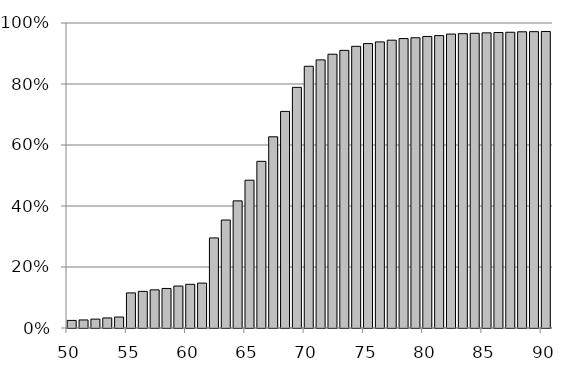
| Category | 100% Adequate |
|---|---|
| 50.0 | 0.025 |
| 51.0 | 0.026 |
| 52.0 | 0.029 |
| 53.0 | 0.033 |
| 54.0 | 0.036 |
| 55.0 | 0.115 |
| 56.0 | 0.12 |
| 57.0 | 0.125 |
| 58.0 | 0.13 |
| 59.0 | 0.138 |
| 60.0 | 0.143 |
| 61.0 | 0.147 |
| 62.0 | 0.295 |
| 63.0 | 0.354 |
| 64.0 | 0.417 |
| 65.0 | 0.485 |
| 66.0 | 0.546 |
| 67.0 | 0.627 |
| 68.0 | 0.71 |
| 69.0 | 0.789 |
| 70.0 | 0.858 |
| 71.0 | 0.879 |
| 72.0 | 0.898 |
| 73.0 | 0.91 |
| 74.0 | 0.924 |
| 75.0 | 0.932 |
| 76.0 | 0.938 |
| 77.0 | 0.944 |
| 78.0 | 0.949 |
| 79.0 | 0.952 |
| 80.0 | 0.956 |
| 81.0 | 0.959 |
| 82.0 | 0.964 |
| 83.0 | 0.965 |
| 84.0 | 0.966 |
| 85.0 | 0.968 |
| 86.0 | 0.969 |
| 87.0 | 0.97 |
| 88.0 | 0.971 |
| 89.0 | 0.972 |
| 90.0 | 0.972 |